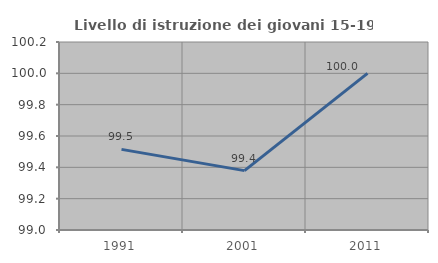
| Category | Livello di istruzione dei giovani 15-19 anni |
|---|---|
| 1991.0 | 99.515 |
| 2001.0 | 99.379 |
| 2011.0 | 100 |